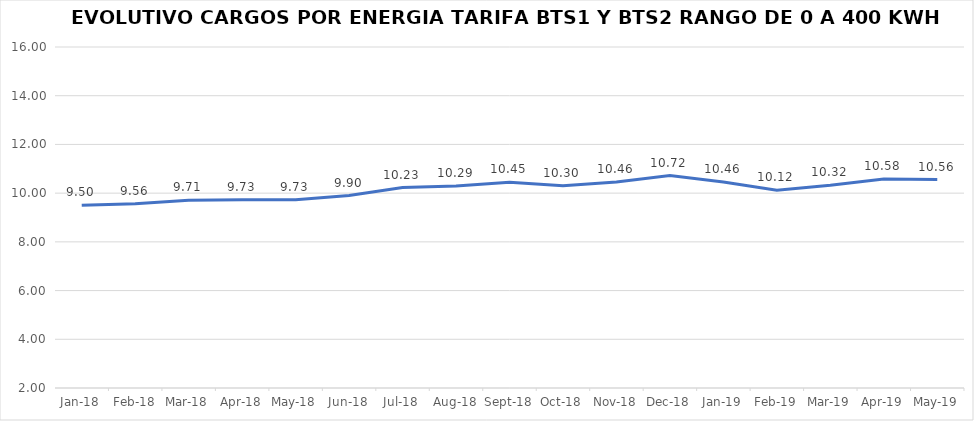
| Category | Series 0 |
|---|---|
| 2018-01-01 | 9.5 |
| 2018-02-01 | 9.56 |
| 2018-03-01 | 9.71 |
| 2018-04-01 | 9.73 |
| 2018-05-01 | 9.73 |
| 2018-06-01 | 9.9 |
| 2018-07-01 | 10.23 |
| 2018-08-01 | 10.29 |
| 2018-09-01 | 10.45 |
| 2018-10-01 | 10.3 |
| 2018-11-01 | 10.46 |
| 2018-12-01 | 10.72 |
| 2019-01-01 | 10.46 |
| 2019-02-01 | 10.12 |
| 2019-03-01 | 10.32 |
| 2019-04-01 | 10.58 |
| 2019-05-01 | 10.56 |